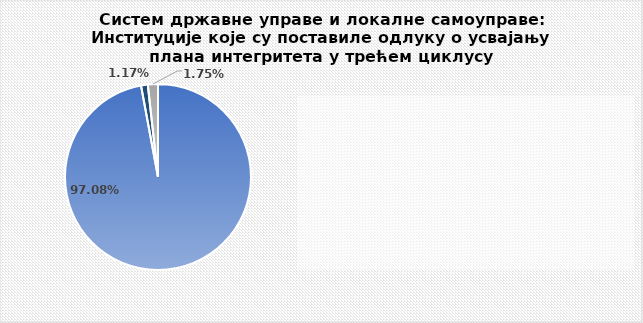
| Category | Series 0 |
|---|---|
| У року и у апликацији | 0.971 |
| Одлука je достављена по истеку рока, изван апликације | 0.012 |
| Одлука није постављена у апликацији | 0.018 |